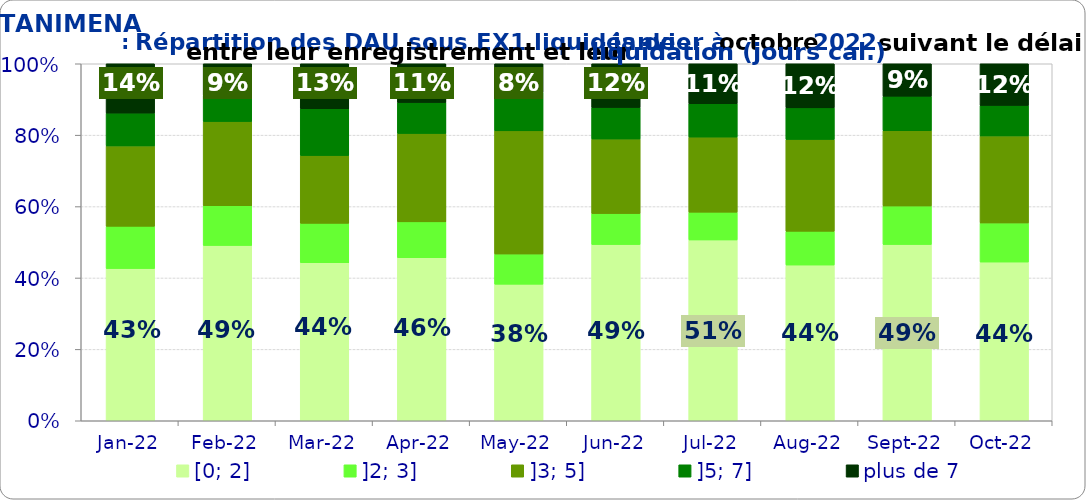
| Category | [0; 2] | ]2; 3] | ]3; 5] | ]5; 7] | plus de 7 |
|---|---|---|---|---|---|
| 2022-01-01 | 0.426 | 0.118 | 0.225 | 0.092 | 0.138 |
| 2022-02-01 | 0.491 | 0.111 | 0.236 | 0.074 | 0.088 |
| 2022-03-01 | 0.443 | 0.11 | 0.19 | 0.131 | 0.126 |
| 2022-04-01 | 0.457 | 0.1 | 0.248 | 0.087 | 0.109 |
| 2022-05-01 | 0.382 | 0.085 | 0.345 | 0.108 | 0.08 |
| 2022-06-01 | 0.494 | 0.087 | 0.209 | 0.088 | 0.123 |
| 2022-07-01 | 0.506 | 0.078 | 0.21 | 0.094 | 0.112 |
| 2022-08-01 | 0.436 | 0.095 | 0.257 | 0.088 | 0.124 |
| 2022-09-01 | 0.494 | 0.108 | 0.211 | 0.097 | 0.091 |
| 2022-10-01 | 0.445 | 0.11 | 0.244 | 0.086 | 0.117 |